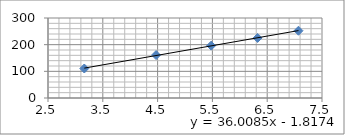
| Category | Series 0 |
|---|---|
| 3.1622776601683795 | 110.6 |
| 4.47213595499958 | 161 |
| 5.477225575051661 | 196.4 |
| 6.324555320336759 | 225.2 |
| 7.0710678118654755 | 252.2 |